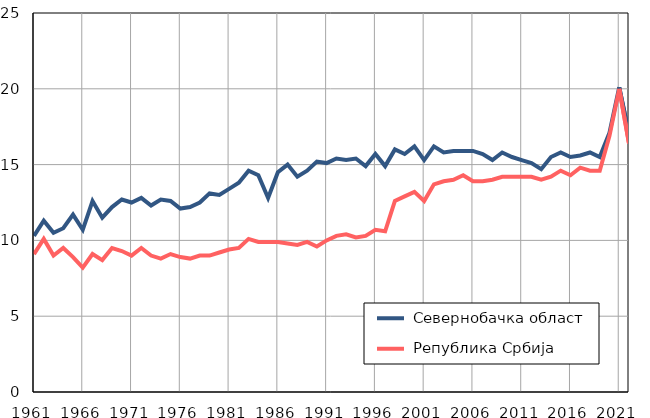
| Category |  Севернобачка област |  Република Србија |
|---|---|---|
| 1961.0 | 10.3 | 9.1 |
| 1962.0 | 11.3 | 10.1 |
| 1963.0 | 10.5 | 9 |
| 1964.0 | 10.8 | 9.5 |
| 1965.0 | 11.7 | 8.9 |
| 1966.0 | 10.7 | 8.2 |
| 1967.0 | 12.6 | 9.1 |
| 1968.0 | 11.5 | 8.7 |
| 1969.0 | 12.2 | 9.5 |
| 1970.0 | 12.7 | 9.3 |
| 1971.0 | 12.5 | 9 |
| 1972.0 | 12.8 | 9.5 |
| 1973.0 | 12.3 | 9 |
| 1974.0 | 12.7 | 8.8 |
| 1975.0 | 12.6 | 9.1 |
| 1976.0 | 12.1 | 8.9 |
| 1977.0 | 12.2 | 8.8 |
| 1978.0 | 12.5 | 9 |
| 1979.0 | 13.1 | 9 |
| 1980.0 | 13 | 9.2 |
| 1981.0 | 13.4 | 9.4 |
| 1982.0 | 13.8 | 9.5 |
| 1983.0 | 14.6 | 10.1 |
| 1984.0 | 14.3 | 9.9 |
| 1985.0 | 12.8 | 9.9 |
| 1986.0 | 14.5 | 9.9 |
| 1987.0 | 15 | 9.8 |
| 1988.0 | 14.2 | 9.7 |
| 1989.0 | 14.6 | 9.9 |
| 1990.0 | 15.2 | 9.6 |
| 1991.0 | 15.1 | 10 |
| 1992.0 | 15.4 | 10.3 |
| 1993.0 | 15.3 | 10.4 |
| 1994.0 | 15.4 | 10.2 |
| 1995.0 | 14.9 | 10.3 |
| 1996.0 | 15.7 | 10.7 |
| 1997.0 | 14.9 | 10.6 |
| 1998.0 | 16 | 12.6 |
| 1999.0 | 15.7 | 12.9 |
| 2000.0 | 16.2 | 13.2 |
| 2001.0 | 15.3 | 12.6 |
| 2002.0 | 16.2 | 13.7 |
| 2003.0 | 15.8 | 13.9 |
| 2004.0 | 15.9 | 14 |
| 2005.0 | 15.9 | 14.3 |
| 2006.0 | 15.9 | 13.9 |
| 2007.0 | 15.7 | 13.9 |
| 2008.0 | 15.3 | 14 |
| 2009.0 | 15.8 | 14.2 |
| 2010.0 | 15.5 | 14.2 |
| 2011.0 | 15.3 | 14.2 |
| 2012.0 | 15.1 | 14.2 |
| 2013.0 | 14.7 | 14 |
| 2014.0 | 15.5 | 14.2 |
| 2015.0 | 15.8 | 14.6 |
| 2016.0 | 15.5 | 14.3 |
| 2017.0 | 15.6 | 14.8 |
| 2018.0 | 15.8 | 14.6 |
| 2019.0 | 15.5 | 14.6 |
| 2020.0 | 17.1 | 16.9 |
| 2021.0 | 20.1 | 20 |
| 2022.0 | 17 | 16.4 |